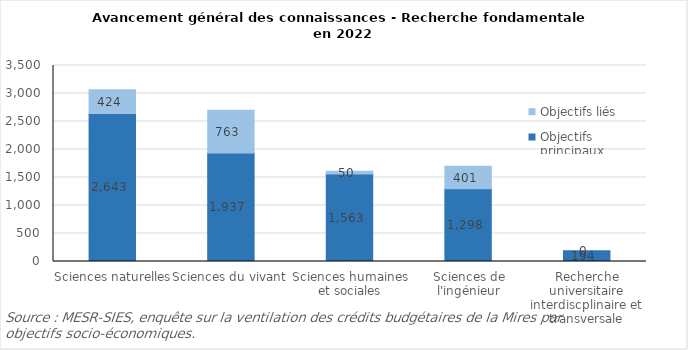
| Category | Objectifs principaux | Objectifs liés |
|---|---|---|
| Sciences naturelles | 2643 | 424 |
| Sciences du vivant | 1937 | 763 |
| Sciences humaines et sociales | 1563 | 50 |
| Sciences de l'ingénieur | 1298 | 401 |
| Recherche universitaire interdiscplinaire et transversale | 194 | 0 |